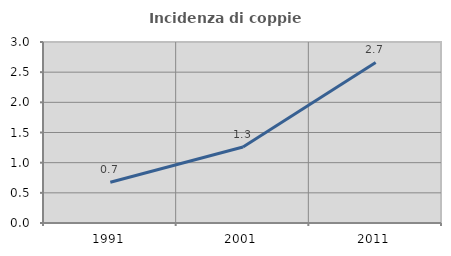
| Category | Incidenza di coppie miste |
|---|---|
| 1991.0 | 0.676 |
| 2001.0 | 1.26 |
| 2011.0 | 2.661 |